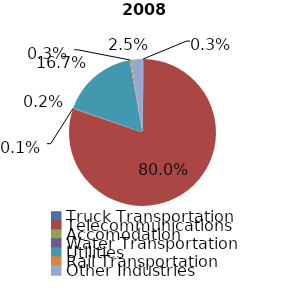
| Category | Series 0 |
|---|---|
| Truck Transportation | 2028171 |
| Telecommunications | 599378766 |
| Accomodation | 704151 |
| Water Transportation | 1303064 |
| Utilities | 124880532 |
| Rail Transportation | 2065997 |
| Other Industries | 19048640 |